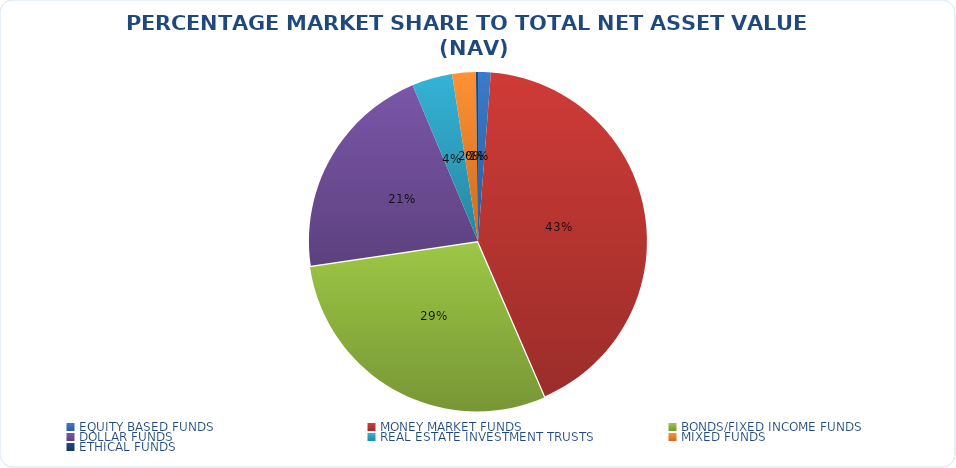
| Category | NET ASSET VALUE |
|---|---|
| EQUITY BASED FUNDS | 15756247273.01 |
| MONEY MARKET FUNDS | 547906811125.902 |
| BONDS/FIXED INCOME FUNDS | 377744976906.65 |
| DOLLAR FUNDS | 272186755417.892 |
| REAL ESTATE INVESTMENT TRUSTS | 50199905204.84 |
| MIXED FUNDS | 29274345691.159 |
| ETHICAL FUNDS | 2532808231.91 |